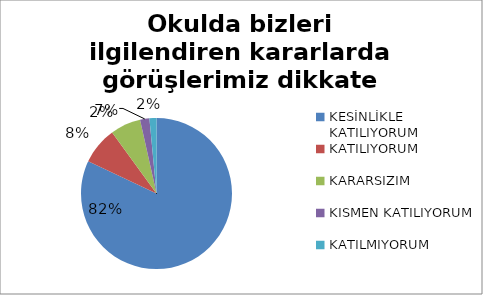
| Category | Okulda bizleri ilgilendiren kararlarda görüşlerimiz dikkate alınır. |
|---|---|
| KESİNLİKLE KATILIYORUM | 164 |
| KATILIYORUM | 16 |
| KARARSIZIM | 13 |
| KISMEN KATILIYORUM | 4 |
| KATILMIYORUM | 3 |